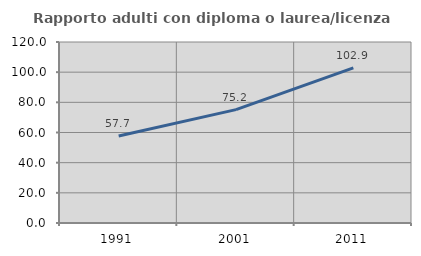
| Category | Rapporto adulti con diploma o laurea/licenza media  |
|---|---|
| 1991.0 | 57.719 |
| 2001.0 | 75.181 |
| 2011.0 | 102.877 |